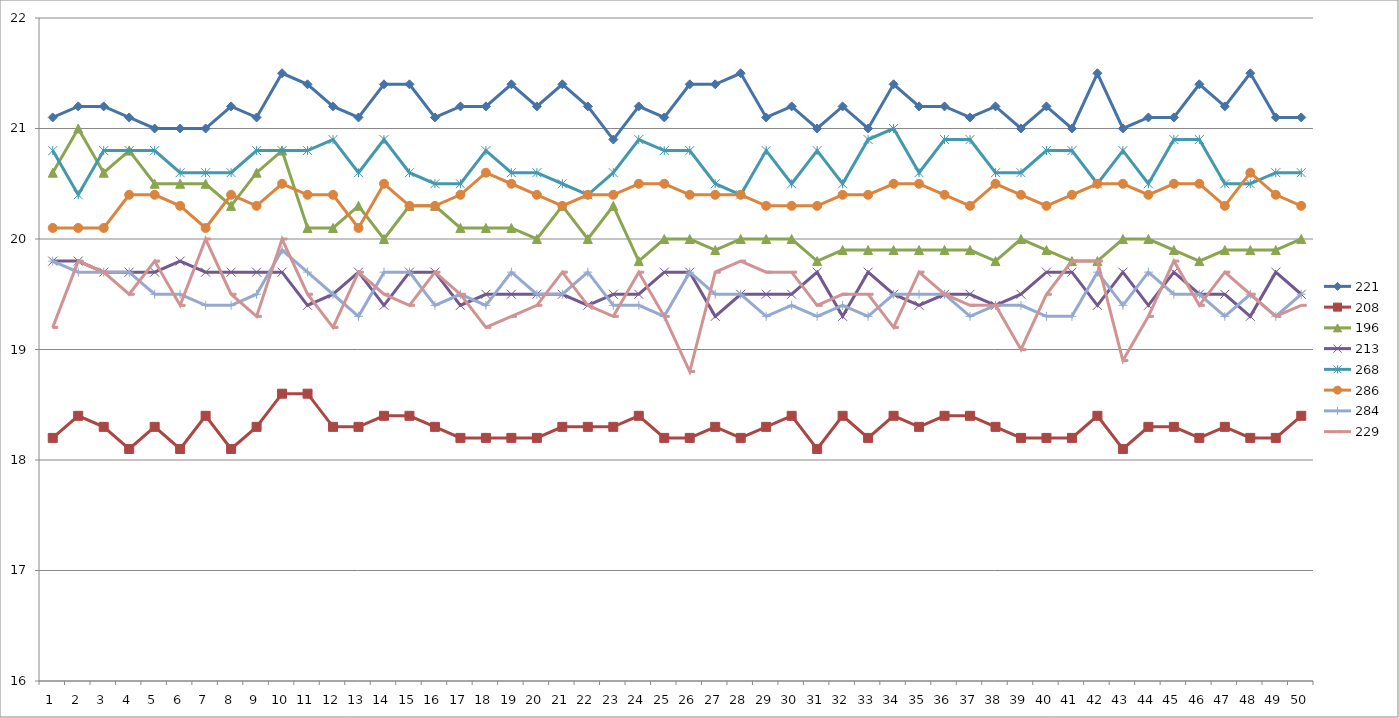
| Category | 221 | 208 | 196 | 213 | 268 | 286 | 284 | 229 |
|---|---|---|---|---|---|---|---|---|
| 0 | 21.1 | 18.2 | 20.6 | 19.8 | 20.8 | 20.1 | 19.8 | 19.2 |
| 1 | 21.2 | 18.4 | 21 | 19.8 | 20.4 | 20.1 | 19.7 | 19.8 |
| 2 | 21.2 | 18.3 | 20.6 | 19.7 | 20.8 | 20.1 | 19.7 | 19.7 |
| 3 | 21.1 | 18.1 | 20.8 | 19.7 | 20.8 | 20.4 | 19.7 | 19.5 |
| 4 | 21 | 18.3 | 20.5 | 19.7 | 20.8 | 20.4 | 19.5 | 19.8 |
| 5 | 21 | 18.1 | 20.5 | 19.8 | 20.6 | 20.3 | 19.5 | 19.4 |
| 6 | 21 | 18.4 | 20.5 | 19.7 | 20.6 | 20.1 | 19.4 | 20 |
| 7 | 21.2 | 18.1 | 20.3 | 19.7 | 20.6 | 20.4 | 19.4 | 19.5 |
| 8 | 21.1 | 18.3 | 20.6 | 19.7 | 20.8 | 20.3 | 19.5 | 19.3 |
| 9 | 21.5 | 18.6 | 20.8 | 19.7 | 20.8 | 20.5 | 19.9 | 20 |
| 10 | 21.4 | 18.6 | 20.1 | 19.4 | 20.8 | 20.4 | 19.7 | 19.5 |
| 11 | 21.2 | 18.3 | 20.1 | 19.5 | 20.9 | 20.4 | 19.5 | 19.2 |
| 12 | 21.1 | 18.3 | 20.3 | 19.7 | 20.6 | 20.1 | 19.3 | 19.7 |
| 13 | 21.4 | 18.4 | 20 | 19.4 | 20.9 | 20.5 | 19.7 | 19.5 |
| 14 | 21.4 | 18.4 | 20.3 | 19.7 | 20.6 | 20.3 | 19.7 | 19.4 |
| 15 | 21.1 | 18.3 | 20.3 | 19.7 | 20.5 | 20.3 | 19.4 | 19.7 |
| 16 | 21.2 | 18.2 | 20.1 | 19.4 | 20.5 | 20.4 | 19.5 | 19.5 |
| 17 | 21.2 | 18.2 | 20.1 | 19.5 | 20.8 | 20.6 | 19.4 | 19.2 |
| 18 | 21.4 | 18.2 | 20.1 | 19.5 | 20.6 | 20.5 | 19.7 | 19.3 |
| 19 | 21.2 | 18.2 | 20 | 19.5 | 20.6 | 20.4 | 19.5 | 19.4 |
| 20 | 21.4 | 18.3 | 20.3 | 19.5 | 20.5 | 20.3 | 19.5 | 19.7 |
| 21 | 21.2 | 18.3 | 20 | 19.4 | 20.4 | 20.4 | 19.7 | 19.4 |
| 22 | 20.9 | 18.3 | 20.3 | 19.5 | 20.6 | 20.4 | 19.4 | 19.3 |
| 23 | 21.2 | 18.4 | 19.8 | 19.5 | 20.9 | 20.5 | 19.4 | 19.7 |
| 24 | 21.1 | 18.2 | 20 | 19.7 | 20.8 | 20.5 | 19.3 | 19.3 |
| 25 | 21.4 | 18.2 | 20 | 19.7 | 20.8 | 20.4 | 19.7 | 18.8 |
| 26 | 21.4 | 18.3 | 19.9 | 19.3 | 20.5 | 20.4 | 19.5 | 19.7 |
| 27 | 21.5 | 18.2 | 20 | 19.5 | 20.4 | 20.4 | 19.5 | 19.8 |
| 28 | 21.1 | 18.3 | 20 | 19.5 | 20.8 | 20.3 | 19.3 | 19.7 |
| 29 | 21.2 | 18.4 | 20 | 19.5 | 20.5 | 20.3 | 19.4 | 19.7 |
| 30 | 21 | 18.1 | 19.8 | 19.7 | 20.8 | 20.3 | 19.3 | 19.4 |
| 31 | 21.2 | 18.4 | 19.9 | 19.3 | 20.5 | 20.4 | 19.4 | 19.5 |
| 32 | 21 | 18.2 | 19.9 | 19.7 | 20.9 | 20.4 | 19.3 | 19.5 |
| 33 | 21.4 | 18.4 | 19.9 | 19.5 | 21 | 20.5 | 19.5 | 19.2 |
| 34 | 21.2 | 18.3 | 19.9 | 19.4 | 20.6 | 20.5 | 19.5 | 19.7 |
| 35 | 21.2 | 18.4 | 19.9 | 19.5 | 20.9 | 20.4 | 19.5 | 19.5 |
| 36 | 21.1 | 18.4 | 19.9 | 19.5 | 20.9 | 20.3 | 19.3 | 19.4 |
| 37 | 21.2 | 18.3 | 19.8 | 19.4 | 20.6 | 20.5 | 19.4 | 19.4 |
| 38 | 21 | 18.2 | 20 | 19.5 | 20.6 | 20.4 | 19.4 | 19 |
| 39 | 21.2 | 18.2 | 19.9 | 19.7 | 20.8 | 20.3 | 19.3 | 19.5 |
| 40 | 21 | 18.2 | 19.8 | 19.7 | 20.8 | 20.4 | 19.3 | 19.8 |
| 41 | 21.5 | 18.4 | 19.8 | 19.4 | 20.5 | 20.5 | 19.7 | 19.8 |
| 42 | 21 | 18.1 | 20 | 19.7 | 20.8 | 20.5 | 19.4 | 18.9 |
| 43 | 21.1 | 18.3 | 20 | 19.4 | 20.5 | 20.4 | 19.7 | 19.3 |
| 44 | 21.1 | 18.3 | 19.9 | 19.7 | 20.9 | 20.5 | 19.5 | 19.8 |
| 45 | 21.4 | 18.2 | 19.8 | 19.5 | 20.9 | 20.5 | 19.5 | 19.4 |
| 46 | 21.2 | 18.3 | 19.9 | 19.5 | 20.5 | 20.3 | 19.3 | 19.7 |
| 47 | 21.5 | 18.2 | 19.9 | 19.3 | 20.5 | 20.6 | 19.5 | 19.5 |
| 48 | 21.1 | 18.2 | 19.9 | 19.7 | 20.6 | 20.4 | 19.3 | 19.3 |
| 49 | 21.1 | 18.4 | 20 | 19.5 | 20.6 | 20.3 | 19.5 | 19.4 |